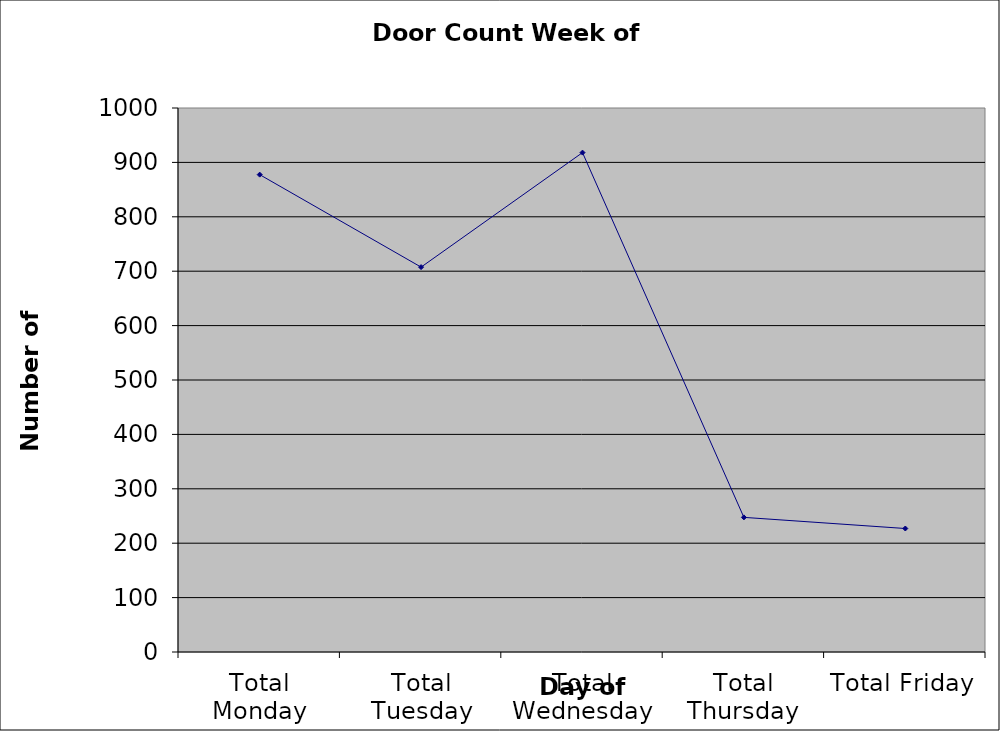
| Category | Series 0 |
|---|---|
| Total Monday | 877.5 |
| Total Tuesday | 707.5 |
| Total Wednesday | 918 |
| Total Thursday | 247.5 |
| Total Friday | 227 |